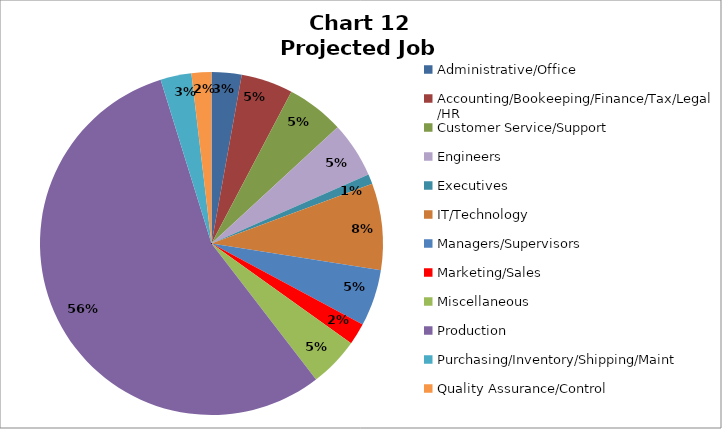
| Category | Series 0 | Series 1 |
|---|---|---|
| Administrative/Office | 92 | 0.028 |
| Accounting/Bookeeping/Finance/Tax/Legal/HR | 159 | 0.048 |
| Customer Service/Support | 177 | 0.054 |
| Engineers | 171 | 0.052 |
| Executives | 30 | 0.009 |
| IT/Technology | 266 | 0.081 |
| Managers/Supervisors | 174 | 0.053 |
| Marketing/Sales | 66 | 0.02 |
| Miscellaneous | 153 | 0.046 |
| Production | 1811 | 0.548 |
| Purchasing/Inventory/Shipping/Maint | 95 | 0.029 |
| Quality Assurance/Control | 61 | 0.018 |